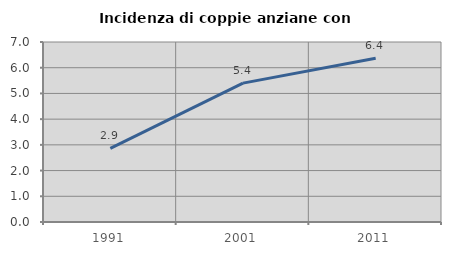
| Category | Incidenza di coppie anziane con figli |
|---|---|
| 1991.0 | 2.861 |
| 2001.0 | 5.4 |
| 2011.0 | 6.367 |